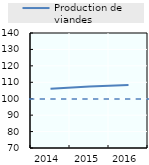
| Category | Production de viandes |
|---|---|
| 2014.0 | 105.992 |
| 2015.0 | 107.365 |
| 2016.0 | 108.398 |